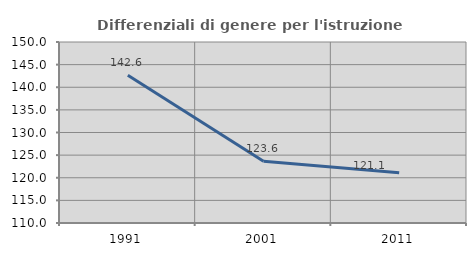
| Category | Differenziali di genere per l'istruzione superiore |
|---|---|
| 1991.0 | 142.649 |
| 2001.0 | 123.628 |
| 2011.0 | 121.12 |